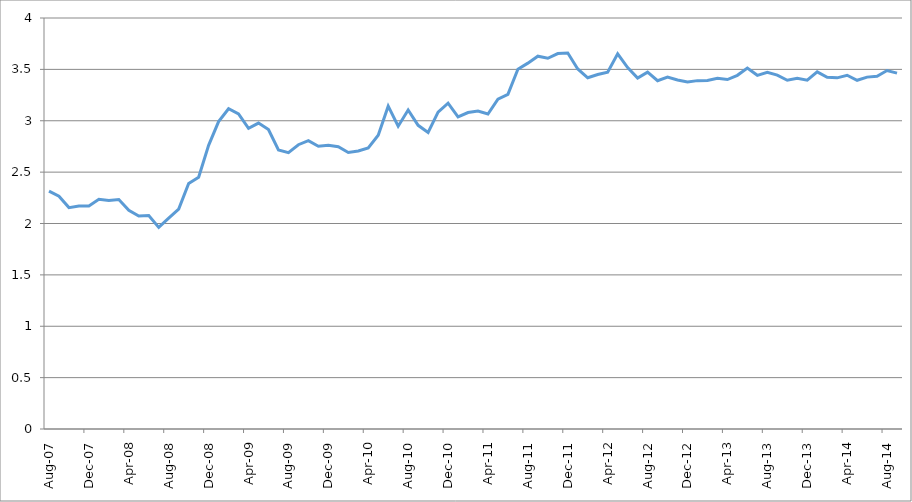
| Category | Series 0 |
|---|---|
| 2007-08-01 | 2.314 |
| 2007-09-01 | 2.265 |
| 2007-10-01 | 2.155 |
| 2007-11-01 | 2.171 |
| 2007-12-01 | 2.172 |
| 2008-01-01 | 2.236 |
| 2008-02-01 | 2.223 |
| 2008-03-01 | 2.233 |
| 2008-04-01 | 2.128 |
| 2008-05-01 | 2.072 |
| 2008-06-01 | 2.077 |
| 2008-07-01 | 1.962 |
| 2008-08-01 | 2.053 |
| 2008-09-01 | 2.14 |
| 2008-10-01 | 2.389 |
| 2008-11-01 | 2.45 |
| 2008-12-01 | 2.76 |
| 2009-01-01 | 2.992 |
| 2009-02-01 | 3.117 |
| 2009-03-01 | 3.067 |
| 2009-04-01 | 2.926 |
| 2009-05-01 | 2.977 |
| 2009-06-01 | 2.915 |
| 2009-07-01 | 2.715 |
| 2009-08-01 | 2.69 |
| 2009-09-01 | 2.767 |
| 2009-10-01 | 2.807 |
| 2009-11-01 | 2.752 |
| 2009-12-01 | 2.762 |
| 2010-01-01 | 2.746 |
| 2010-02-01 | 2.691 |
| 2010-03-01 | 2.706 |
| 2010-04-01 | 2.735 |
| 2010-05-01 | 2.859 |
| 2010-06-01 | 3.142 |
| 2010-07-01 | 2.946 |
| 2010-08-01 | 3.104 |
| 2010-09-01 | 2.955 |
| 2010-10-01 | 2.887 |
| 2010-11-01 | 3.085 |
| 2010-12-01 | 3.17 |
| 2011-01-01 | 3.037 |
| 2011-02-01 | 3.08 |
| 2011-03-01 | 3.095 |
| 2011-04-01 | 3.066 |
| 2011-05-01 | 3.211 |
| 2011-06-01 | 3.258 |
| 2011-07-01 | 3.502 |
| 2011-08-01 | 3.561 |
| 2011-09-01 | 3.628 |
| 2011-10-01 | 3.608 |
| 2011-11-01 | 3.654 |
| 2011-12-01 | 3.659 |
| 2012-01-01 | 3.504 |
| 2012-02-01 | 3.418 |
| 2012-03-01 | 3.45 |
| 2012-04-01 | 3.472 |
| 2012-05-01 | 3.651 |
| 2012-06-01 | 3.517 |
| 2012-07-01 | 3.415 |
| 2012-08-01 | 3.473 |
| 2012-09-01 | 3.389 |
| 2012-10-01 | 3.424 |
| 2012-11-01 | 3.396 |
| 2012-12-01 | 3.377 |
| 2013-01-01 | 3.39 |
| 2013-02-01 | 3.393 |
| 2013-03-01 | 3.414 |
| 2013-04-01 | 3.401 |
| 2013-05-01 | 3.442 |
| 2013-06-01 | 3.513 |
| 2013-07-01 | 3.442 |
| 2013-08-01 | 3.472 |
| 2013-09-01 | 3.444 |
| 2013-10-01 | 3.394 |
| 2013-11-01 | 3.414 |
| 2013-12-01 | 3.395 |
| 2014-01-01 | 3.476 |
| 2014-02-01 | 3.424 |
| 2014-03-01 | 3.418 |
| 2014-04-01 | 3.443 |
| 2014-05-01 | 3.394 |
| 2014-06-01 | 3.425 |
| 2014-07-01 | 3.433 |
| 2014-08-01 | 3.489 |
| 2014-09-01 | 3.464 |